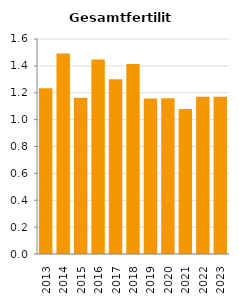
| Category | Gesamtfertilität |
|---|---|
| 2013.0 | 1.234 |
| 2014.0 | 1.492 |
| 2015.0 | 1.162 |
| 2016.0 | 1.447 |
| 2017.0 | 1.3 |
| 2018.0 | 1.414 |
| 2019.0 | 1.157 |
| 2020.0 | 1.16 |
| 2021.0 | 1.079 |
| 2022.0 | 1.17 |
| 2023.0 | 1.17 |